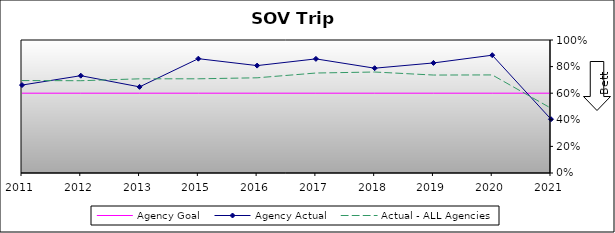
| Category | Agency Goal | Agency Actual | Actual - ALL Agencies |
|---|---|---|---|
| 2011.0 | 0.6 | 0.661 | 0.695 |
| 2012.0 | 0.6 | 0.732 | 0.694 |
| 2013.0 | 0.6 | 0.648 | 0.708 |
| 2015.0 | 0.6 | 0.86 | 0.708 |
| 2016.0 | 0.6 | 0.808 | 0.716 |
| 2017.0 | 0.6 | 0.858 | 0.752 |
| 2018.0 | 0.6 | 0.788 | 0.759 |
| 2019.0 | 0.6 | 0.828 | 0.736 |
| 2020.0 | 0.6 | 0.886 | 0.737 |
| 2021.0 | 0.6 | 0.404 | 0.487 |